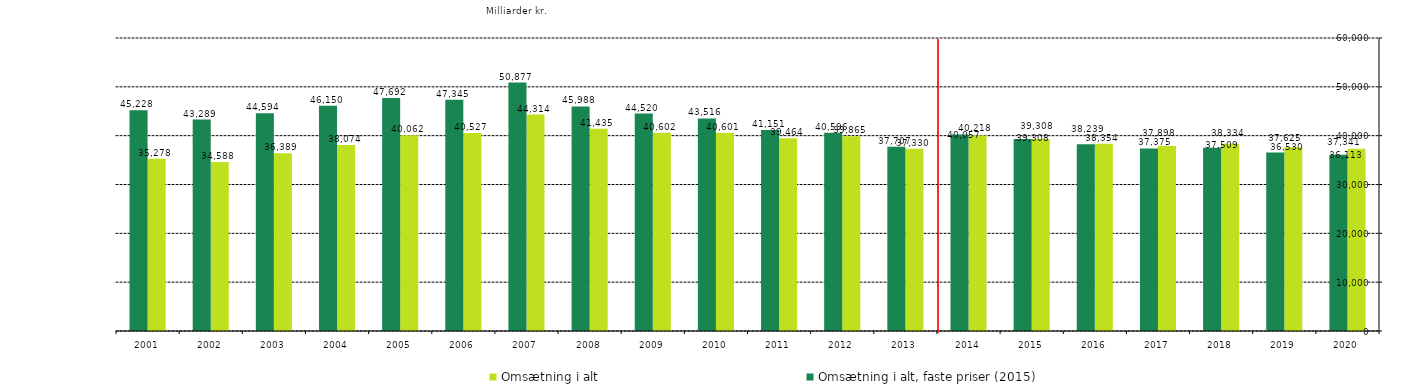
| Category | Omsætning i alt | Omsætning i alt, faste priser (2015) |
|---|---|---|
| 2020.0 | 37341.357 | 36113.498 |
| 2019.0 | 37625.477 | 36529.59 |
| 2018.0 | 38333.989 | 37508.795 |
| 2017.0 | 37897.985 | 37374.739 |
| 2016.0 | 38353.811 | 38239.094 |
| 2015.0 | 39307.582 | 39307.582 |
| 2014.0 | 40056.669 | 40217.539 |
| 2013.0 | 37330.068 | 37707.139 |
| 2012.0 | 39864.928 | 40595.65 |
| 2011.0 | 39464.007 | 41151.206 |
| 2010.0 | 40600.517 | 43516.095 |
| 2009.0 | 40601.91 | 44519.638 |
| 2008.0 | 41434.892 | 45987.672 |
| 2007.0 | 44313.991 | 50877.142 |
| 2006.0 | 40527.202 | 47344.862 |
| 2005.0 | 40061.522 | 47692.288 |
| 2004.0 | 38073.875 | 46150.151 |
| 2003.0 | 36389.021 | 44594.388 |
| 2002.0 | 34587.914 | 43289.004 |
| 2001.0 | 35277.741 | 45227.873 |